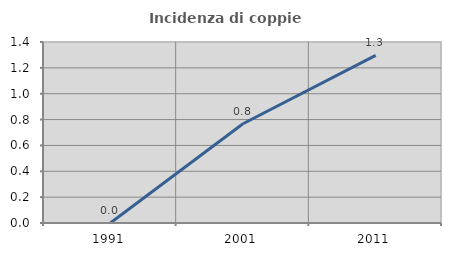
| Category | Incidenza di coppie miste |
|---|---|
| 1991.0 | 0 |
| 2001.0 | 0.767 |
| 2011.0 | 1.297 |